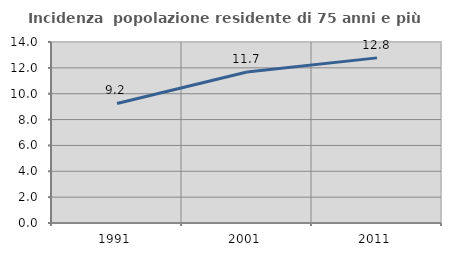
| Category | Incidenza  popolazione residente di 75 anni e più |
|---|---|
| 1991.0 | 9.245 |
| 2001.0 | 11.676 |
| 2011.0 | 12.772 |